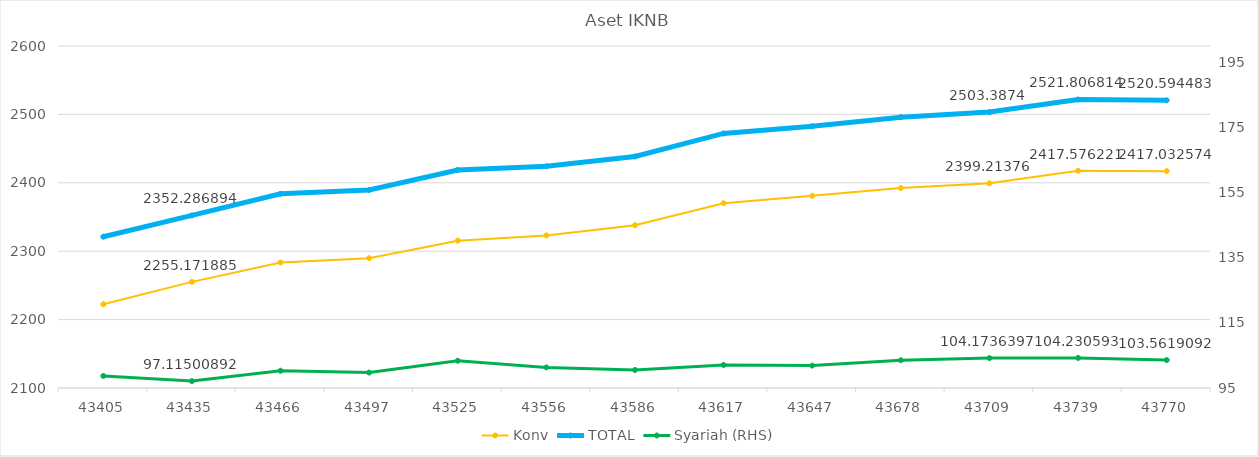
| Category | Konv | TOTAL |
|---|---|---|
| 43405.0 | 2222.478 | 2321.18 |
| 43435.0 | 2255.172 | 2352.287 |
| 43466.0 | 2283.536 | 2383.836 |
| 43497.0 | 2289.807 | 2389.536 |
| 43525.0 | 2315.383 | 2418.739 |
| 43556.0 | 2323.04 | 2424.36 |
| 43586.0 | 2338.007 | 2438.533 |
| 43617.0 | 2370.128 | 2472.191 |
| 43647.0 | 2380.927 | 2482.798 |
| 43678.0 | 2392.476 | 2495.993 |
| 43709.0 | 2399.214 | 2503.387 |
| 43739.0 | 2417.576 | 2521.807 |
| 43770.0 | 2417.033 | 2520.594 |